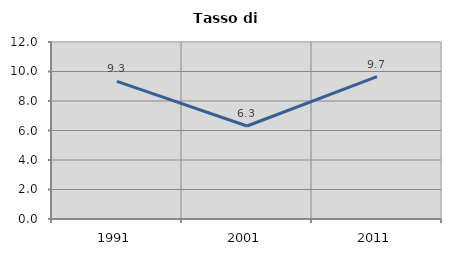
| Category | Tasso di disoccupazione   |
|---|---|
| 1991.0 | 9.333 |
| 2001.0 | 6.306 |
| 2011.0 | 9.653 |